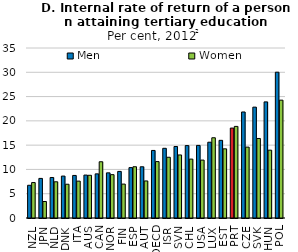
| Category | Men | Women |
|---|---|---|
| NZL | 6.738 | 7.297 |
| JPN | 8.152 | 3.396 |
| NLD | 8.341 | 7.455 |
| DNK | 8.633 | 6.949 |
| ITA | 8.762 | 7.593 |
| AUS | 8.839 | 8.793 |
| CAN | 9.085 | 11.579 |
| NOR | 9.295 | 8.924 |
| FIN | 9.593 | 6.982 |
| ESP | 10.372 | 10.554 |
| AUT | 10.548 | 7.629 |
| OECD | 13.908 | 11.614 |
| ISR | 14.349 | 12.506 |
| SVN | 14.719 | 12.98 |
| CHL | 14.908 | 12.126 |
| USA | 14.948 | 11.922 |
| LUX | 15.604 | 16.52 |
| EST | 15.989 | 14.24 |
| PRT | 18.517 | 18.86 |
| CZE | 21.829 | 14.592 |
| SVK | 22.827 | 16.372 |
| HUN | 23.904 | 13.968 |
| POL | 30.02 | 24.265 |